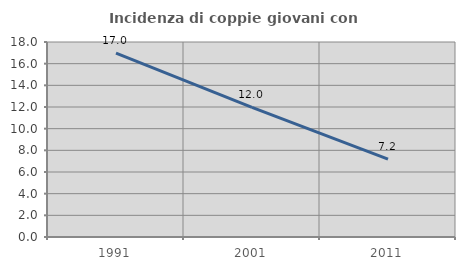
| Category | Incidenza di coppie giovani con figli |
|---|---|
| 1991.0 | 16.965 |
| 2001.0 | 11.959 |
| 2011.0 | 7.189 |